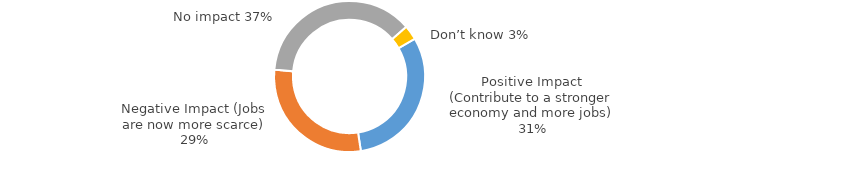
| Category | Series 0 |
|---|---|
| Positive Impact (Contribute to a stronger economy and more jobs) | 0.309 |
| Negative Impact (Jobs are now more scarce) | 0.289 |
| No impact | 0.371 |
| Don’t know | 0.031 |